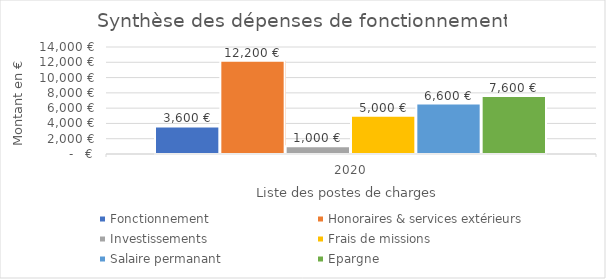
| Category | Fonctionnement  | Honoraires & services extérieurs | Investissements | Frais de missions | Salaire permanant  | Epargne |
|---|---|---|---|---|---|---|
| 0 | 3600 | 12200 | 1000 | 5000 | 6600 | 7600 |